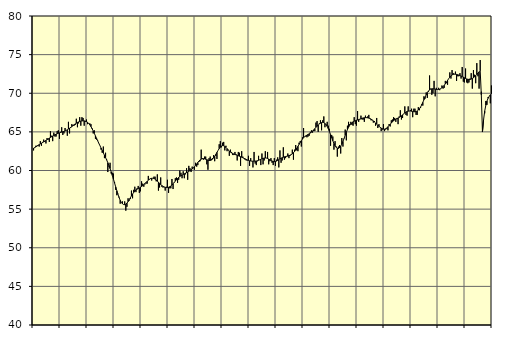
| Category | Samtliga anställda (inkl. anställda utomlands) | Series 1 |
|---|---|---|
| nan | 62.6 | 62.89 |
| 87.0 | 63 | 62.96 |
| 87.0 | 63.2 | 63.06 |
| 87.0 | 63.2 | 63.16 |
| 87.0 | 63.2 | 63.26 |
| 87.0 | 63.1 | 63.35 |
| 87.0 | 63.8 | 63.44 |
| 87.0 | 63.2 | 63.53 |
| 87.0 | 63.7 | 63.62 |
| 87.0 | 64 | 63.71 |
| 87.0 | 63.7 | 63.8 |
| 87.0 | 63.5 | 63.89 |
| nan | 64.2 | 63.99 |
| 88.0 | 64 | 64.09 |
| 88.0 | 63.7 | 64.19 |
| 88.0 | 65.1 | 64.28 |
| 88.0 | 64.5 | 64.37 |
| 88.0 | 63.8 | 64.46 |
| 88.0 | 64.9 | 64.55 |
| 88.0 | 64.4 | 64.63 |
| 88.0 | 64.4 | 64.7 |
| 88.0 | 65.1 | 64.76 |
| 88.0 | 65.2 | 64.82 |
| 88.0 | 64.1 | 64.87 |
| nan | 65 | 64.92 |
| 89.0 | 65.6 | 64.97 |
| 89.0 | 64.6 | 65.02 |
| 89.0 | 64.8 | 65.07 |
| 89.0 | 65.5 | 65.12 |
| 89.0 | 65.2 | 65.19 |
| 89.0 | 64.5 | 65.27 |
| 89.0 | 66.3 | 65.37 |
| 89.0 | 64.8 | 65.47 |
| 89.0 | 65.5 | 65.58 |
| 89.0 | 66 | 65.69 |
| 89.0 | 65.9 | 65.81 |
| nan | 65.8 | 65.92 |
| 90.0 | 65.9 | 66.03 |
| 90.0 | 66.7 | 66.13 |
| 90.0 | 65.6 | 66.22 |
| 90.0 | 66.1 | 66.29 |
| 90.0 | 66.9 | 66.35 |
| 90.0 | 65.8 | 66.39 |
| 90.0 | 66.9 | 66.42 |
| 90.0 | 66.8 | 66.43 |
| 90.0 | 65.8 | 66.42 |
| 90.0 | 66.3 | 66.39 |
| 90.0 | 66.6 | 66.33 |
| nan | 66 | 66.23 |
| 91.0 | 66.1 | 66.09 |
| 91.0 | 66.1 | 65.91 |
| 91.0 | 66 | 65.68 |
| 91.0 | 65.5 | 65.42 |
| 91.0 | 64.8 | 65.13 |
| 91.0 | 65.2 | 64.81 |
| 91.0 | 64.1 | 64.48 |
| 91.0 | 64 | 64.16 |
| 91.0 | 63.9 | 63.84 |
| 91.0 | 63.5 | 63.52 |
| 91.0 | 63.2 | 63.22 |
| nan | 62.7 | 62.91 |
| 92.0 | 62.3 | 62.6 |
| 92.0 | 63.1 | 62.29 |
| 92.0 | 61.6 | 61.98 |
| 92.0 | 62.3 | 61.67 |
| 92.0 | 61.4 | 61.35 |
| 92.0 | 59.8 | 61.01 |
| 92.0 | 60.5 | 60.64 |
| 92.0 | 61 | 60.25 |
| 92.0 | 59.6 | 59.82 |
| 92.0 | 59.7 | 59.36 |
| 92.0 | 59.6 | 58.88 |
| nan | 58.5 | 58.38 |
| 93.0 | 57.5 | 57.88 |
| 93.0 | 56.8 | 57.38 |
| 93.0 | 57 | 56.92 |
| 93.0 | 56.6 | 56.5 |
| 93.0 | 55.7 | 56.14 |
| 93.0 | 55.9 | 55.87 |
| 93.0 | 56 | 55.69 |
| 93.0 | 55.6 | 55.59 |
| 93.0 | 56 | 55.58 |
| 93.0 | 54.8 | 55.65 |
| 93.0 | 55.3 | 55.78 |
| nan | 56.4 | 55.97 |
| 94.0 | 56.1 | 56.2 |
| 94.0 | 56.3 | 56.46 |
| 94.0 | 57.4 | 56.71 |
| 94.0 | 56.4 | 56.95 |
| 94.0 | 57.5 | 57.16 |
| 94.0 | 57.9 | 57.34 |
| 94.0 | 57.2 | 57.48 |
| 94.0 | 57.7 | 57.58 |
| 94.0 | 58 | 57.67 |
| 94.0 | 57.1 | 57.74 |
| 94.0 | 57.3 | 57.83 |
| nan | 58.6 | 57.93 |
| 95.0 | 58.3 | 58.04 |
| 95.0 | 57.9 | 58.17 |
| 95.0 | 58.2 | 58.31 |
| 95.0 | 58.3 | 58.46 |
| 95.0 | 58.3 | 58.61 |
| 95.0 | 59.3 | 58.75 |
| 95.0 | 58.9 | 58.86 |
| 95.0 | 59 | 58.95 |
| 95.0 | 58.7 | 58.99 |
| 95.0 | 59 | 59 |
| 95.0 | 59.2 | 58.97 |
| nan | 59.2 | 58.89 |
| 96.0 | 58.6 | 58.77 |
| 96.0 | 59.5 | 58.63 |
| 96.0 | 57.4 | 58.48 |
| 96.0 | 57.8 | 58.33 |
| 96.0 | 59.1 | 58.19 |
| 96.0 | 57.9 | 58.06 |
| 96.0 | 57.8 | 57.95 |
| 96.0 | 57.9 | 57.86 |
| 96.0 | 57.4 | 57.81 |
| 96.0 | 57.9 | 57.79 |
| 96.0 | 58.8 | 57.8 |
| nan | 57.1 | 57.83 |
| 97.0 | 57.7 | 57.9 |
| 97.0 | 57.7 | 57.99 |
| 97.0 | 58.9 | 58.12 |
| 97.0 | 57.6 | 58.28 |
| 97.0 | 58.5 | 58.45 |
| 97.0 | 59 | 58.63 |
| 97.0 | 59.1 | 58.8 |
| 97.0 | 58.4 | 58.96 |
| 97.0 | 58.8 | 59.11 |
| 97.0 | 60 | 59.23 |
| 97.0 | 59.7 | 59.33 |
| nan | 59 | 59.41 |
| 98.0 | 59.9 | 59.49 |
| 98.0 | 59 | 59.57 |
| 98.0 | 59.5 | 59.65 |
| 98.0 | 60.3 | 59.73 |
| 98.0 | 58.8 | 59.81 |
| 98.0 | 60.6 | 59.9 |
| 98.0 | 60.3 | 59.99 |
| 98.0 | 59.8 | 60.09 |
| 98.0 | 60.5 | 60.2 |
| 98.0 | 60.3 | 60.33 |
| 98.0 | 60.1 | 60.48 |
| nan | 61 | 60.66 |
| 99.0 | 60.5 | 60.85 |
| 99.0 | 60.7 | 61.04 |
| 99.0 | 61.1 | 61.22 |
| 99.0 | 61.2 | 61.37 |
| 99.0 | 62.7 | 61.47 |
| 99.0 | 61.6 | 61.52 |
| 99.0 | 61.4 | 61.53 |
| 99.0 | 61.8 | 61.51 |
| 99.0 | 61.8 | 61.46 |
| 99.0 | 60.8 | 61.4 |
| 99.0 | 60.1 | 61.34 |
| nan | 61.6 | 61.3 |
| 0.0 | 61.8 | 61.3 |
| 0.0 | 61.5 | 61.35 |
| 0.0 | 61.6 | 61.46 |
| 0.0 | 62 | 61.63 |
| 0.0 | 61.2 | 61.84 |
| 0.0 | 61.9 | 62.09 |
| 0.0 | 61.5 | 62.35 |
| 0.0 | 62.6 | 62.6 |
| 0.0 | 63.4 | 62.83 |
| 0.0 | 63.8 | 63.02 |
| 0.0 | 63 | 63.16 |
| nan | 63.6 | 63.22 |
| 1.0 | 63.7 | 63.2 |
| 1.0 | 62.6 | 63.12 |
| 1.0 | 63.2 | 62.99 |
| 1.0 | 62.5 | 62.83 |
| 1.0 | 62.7 | 62.66 |
| 1.0 | 61.9 | 62.51 |
| 1.0 | 62.7 | 62.38 |
| 1.0 | 62.4 | 62.28 |
| 1.0 | 62 | 62.2 |
| 1.0 | 62 | 62.13 |
| 1.0 | 62.4 | 62.08 |
| nan | 62.1 | 62.02 |
| 2.0 | 61.3 | 61.97 |
| 2.0 | 62.4 | 61.91 |
| 2.0 | 62.3 | 61.85 |
| 2.0 | 60.6 | 61.79 |
| 2.0 | 62.5 | 61.72 |
| 2.0 | 61.8 | 61.65 |
| 2.0 | 61.6 | 61.58 |
| 2.0 | 61.4 | 61.51 |
| 2.0 | 61.3 | 61.44 |
| 2.0 | 61.3 | 61.37 |
| 2.0 | 61.9 | 61.31 |
| nan | 60.6 | 61.26 |
| 3.0 | 61.6 | 61.23 |
| 3.0 | 61.2 | 61.21 |
| 3.0 | 60.4 | 61.2 |
| 3.0 | 62.4 | 61.21 |
| 3.0 | 60.9 | 61.22 |
| 3.0 | 60.7 | 61.23 |
| 3.0 | 61.2 | 61.27 |
| 3.0 | 61.9 | 61.32 |
| 3.0 | 61.4 | 61.38 |
| 3.0 | 60.7 | 61.45 |
| 3.0 | 62.2 | 61.52 |
| nan | 60.8 | 61.57 |
| 4.0 | 61.3 | 61.61 |
| 4.0 | 62.5 | 61.62 |
| 4.0 | 61.6 | 61.61 |
| 4.0 | 62.4 | 61.56 |
| 4.0 | 60.8 | 61.48 |
| 4.0 | 61.2 | 61.4 |
| 4.0 | 61.6 | 61.31 |
| 4.0 | 61 | 61.23 |
| 4.0 | 60.7 | 61.17 |
| 4.0 | 61.6 | 61.15 |
| 4.0 | 60.6 | 61.17 |
| nan | 61.4 | 61.22 |
| 5.0 | 61.7 | 61.31 |
| 5.0 | 60.4 | 61.4 |
| 5.0 | 62.6 | 61.5 |
| 5.0 | 61 | 61.59 |
| 5.0 | 61.3 | 61.66 |
| 5.0 | 63 | 61.72 |
| 5.0 | 61.4 | 61.77 |
| 5.0 | 61.6 | 61.8 |
| 5.0 | 61.8 | 61.84 |
| 5.0 | 62.2 | 61.87 |
| 5.0 | 61.6 | 61.92 |
| nan | 61.9 | 61.98 |
| 6.0 | 62.1 | 62.06 |
| 6.0 | 62.7 | 62.16 |
| 6.0 | 61.4 | 62.3 |
| 6.0 | 62.7 | 62.46 |
| 6.0 | 63.3 | 62.66 |
| 6.0 | 62.6 | 62.89 |
| 6.0 | 62.5 | 63.13 |
| 6.0 | 63.6 | 63.38 |
| 6.0 | 63.8 | 63.63 |
| 6.0 | 63.1 | 63.86 |
| 6.0 | 64.3 | 64.07 |
| nan | 65.5 | 64.25 |
| 7.0 | 64.4 | 64.38 |
| 7.0 | 64.4 | 64.49 |
| 7.0 | 64.3 | 64.58 |
| 7.0 | 64.4 | 64.66 |
| 7.0 | 64.5 | 64.75 |
| 7.0 | 65 | 64.85 |
| 7.0 | 65.2 | 64.96 |
| 7.0 | 64.9 | 65.1 |
| 7.0 | 65.1 | 65.26 |
| 7.0 | 65.1 | 65.42 |
| 7.0 | 66.2 | 65.59 |
| nan | 66.4 | 65.74 |
| 8.0 | 65 | 65.88 |
| 8.0 | 66.1 | 66.02 |
| 8.0 | 66.5 | 66.12 |
| 8.0 | 65.2 | 66.2 |
| 8.0 | 66.5 | 66.23 |
| 8.0 | 67 | 66.2 |
| 8.0 | 65.6 | 66.1 |
| 8.0 | 66 | 65.94 |
| 8.0 | 66.3 | 65.71 |
| 8.0 | 65.8 | 65.41 |
| 8.0 | 65.4 | 65.05 |
| nan | 63.2 | 64.65 |
| 9.0 | 64.6 | 64.24 |
| 9.0 | 64.4 | 63.85 |
| 9.0 | 62.7 | 63.5 |
| 9.0 | 63.8 | 63.21 |
| 9.0 | 63.1 | 63 |
| 9.0 | 61.8 | 62.89 |
| 9.0 | 63.1 | 62.87 |
| 9.0 | 63.3 | 62.96 |
| 9.0 | 62.2 | 63.15 |
| 9.0 | 64.2 | 63.42 |
| 9.0 | 63.1 | 63.76 |
| nan | 64.1 | 64.15 |
| 10.0 | 65.3 | 64.56 |
| 10.0 | 63.9 | 64.95 |
| 10.0 | 65.8 | 65.3 |
| 10.0 | 66.3 | 65.6 |
| 10.0 | 66 | 65.85 |
| 10.0 | 66.3 | 66.04 |
| 10.0 | 65.9 | 66.19 |
| 10.0 | 65.8 | 66.3 |
| 10.0 | 66.9 | 66.39 |
| 10.0 | 66 | 66.45 |
| 10.0 | 65.8 | 66.51 |
| nan | 67.7 | 66.54 |
| 11.0 | 66.3 | 66.59 |
| 11.0 | 66.6 | 66.65 |
| 11.0 | 67.1 | 66.71 |
| 11.0 | 66.6 | 66.76 |
| 11.0 | 66.6 | 66.8 |
| 11.0 | 66.3 | 66.83 |
| 11.0 | 67.1 | 66.84 |
| 11.0 | 66.8 | 66.84 |
| 11.0 | 67 | 66.82 |
| 11.0 | 67.2 | 66.78 |
| 11.0 | 66.7 | 66.73 |
| nan | 66.5 | 66.65 |
| 12.0 | 66.5 | 66.55 |
| 12.0 | 66.2 | 66.42 |
| 12.0 | 66.4 | 66.28 |
| 12.0 | 65.8 | 66.14 |
| 12.0 | 66.8 | 66 |
| 12.0 | 65.5 | 65.86 |
| 12.0 | 66 | 65.73 |
| 12.0 | 65.6 | 65.6 |
| 12.0 | 65.1 | 65.49 |
| 12.0 | 65.3 | 65.41 |
| 12.0 | 66 | 65.36 |
| nan | 65.1 | 65.35 |
| 13.0 | 65.3 | 65.41 |
| 13.0 | 65.4 | 65.51 |
| 13.0 | 65.2 | 65.65 |
| 13.0 | 66 | 65.81 |
| 13.0 | 65.7 | 65.99 |
| 13.0 | 66.5 | 66.15 |
| 13.0 | 66.6 | 66.31 |
| 13.0 | 66.9 | 66.44 |
| 13.0 | 66.8 | 66.55 |
| 13.0 | 66.3 | 66.64 |
| 13.0 | 66.8 | 66.72 |
| nan | 66 | 66.79 |
| 14.0 | 67 | 66.87 |
| 14.0 | 67.8 | 66.96 |
| 14.0 | 66.6 | 67.08 |
| 14.0 | 66.8 | 67.2 |
| 14.0 | 67.3 | 67.33 |
| 14.0 | 68.3 | 67.45 |
| 14.0 | 67.2 | 67.56 |
| 14.0 | 67.1 | 67.64 |
| 14.0 | 68.3 | 67.68 |
| 14.0 | 67.7 | 67.7 |
| 14.0 | 67.8 | 67.7 |
| nan | 68 | 67.67 |
| 15.0 | 66.9 | 67.64 |
| 15.0 | 68 | 67.61 |
| 15.0 | 68 | 67.6 |
| 15.0 | 67.2 | 67.64 |
| 15.0 | 67.2 | 67.7 |
| 15.0 | 68.2 | 67.82 |
| 15.0 | 67.8 | 67.99 |
| 15.0 | 68.1 | 68.22 |
| 15.0 | 68.6 | 68.5 |
| 15.0 | 68.4 | 68.82 |
| 15.0 | 69.6 | 69.16 |
| nan | 69.3 | 69.49 |
| 16.0 | 70.1 | 69.81 |
| 16.0 | 69.4 | 70.08 |
| 16.0 | 70.2 | 70.29 |
| 16.0 | 72.3 | 70.44 |
| 16.0 | 70.6 | 70.53 |
| 16.0 | 69.8 | 70.57 |
| 16.0 | 70 | 70.58 |
| 16.0 | 71.6 | 70.55 |
| 16.0 | 69.6 | 70.52 |
| 16.0 | 70.7 | 70.49 |
| 16.0 | 70.5 | 70.48 |
| nan | 70.7 | 70.5 |
| 17.0 | 70.4 | 70.54 |
| 17.0 | 70.6 | 70.61 |
| 17.0 | 71 | 70.72 |
| 17.0 | 70.6 | 70.86 |
| 17.0 | 70.7 | 71.02 |
| 17.0 | 71.6 | 71.22 |
| 17.0 | 71.3 | 71.44 |
| 17.0 | 71.1 | 71.67 |
| 17.0 | 71.9 | 71.89 |
| 17.0 | 72.7 | 72.09 |
| 17.0 | 71.9 | 72.25 |
| nan | 73 | 72.37 |
| 18.0 | 72.6 | 72.44 |
| 18.0 | 72.5 | 72.47 |
| 18.0 | 72.8 | 72.46 |
| 18.0 | 71.6 | 72.44 |
| 18.0 | 72.2 | 72.4 |
| 18.0 | 72.2 | 72.35 |
| 18.0 | 72.6 | 72.3 |
| 18.0 | 71.9 | 72.23 |
| 18.0 | 73.4 | 72.16 |
| 18.0 | 71.5 | 72.09 |
| 18.0 | 71.4 | 72 |
| nan | 73.2 | 71.92 |
| 19.0 | 71.4 | 71.85 |
| 19.0 | 71.3 | 71.81 |
| 19.0 | 71.4 | 71.79 |
| 19.0 | 71.9 | 71.79 |
| 19.0 | 72.6 | 71.84 |
| 19.0 | 70.6 | 71.91 |
| 19.0 | 73 | 72.01 |
| 19.0 | 72.4 | 72.14 |
| 19.0 | 71.3 | 72.28 |
| 19.0 | 73.9 | 72.44 |
| 19.0 | 72.2 | 72.61 |
| nan | 70.6 | 72.77 |
| 20.0 | 74.3 | 72.92 |
| 20.0 | 70.2 | 69.8 |
| 20.0 | 65.1 | 64.98 |
| 20.0 | 66.6 | 66.57 |
| 20.0 | 67.4 | 67.68 |
| 20.0 | 69 | 68.45 |
| 20.0 | 68.5 | 68.98 |
| 20.0 | 69.5 | 69.35 |
| 20.0 | 69.6 | 69.6 |
| 20.0 | 68.7 | 69.79 |
| 20.0 | 71 | 69.93 |